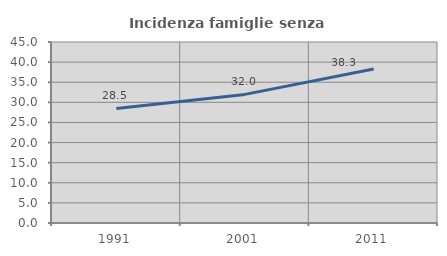
| Category | Incidenza famiglie senza nuclei |
|---|---|
| 1991.0 | 28.484 |
| 2001.0 | 31.972 |
| 2011.0 | 38.282 |